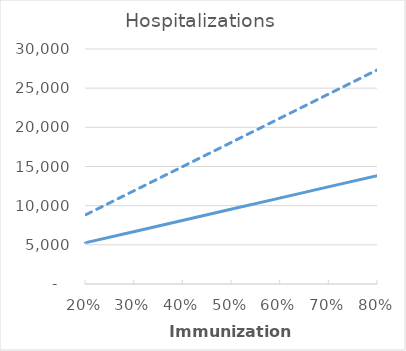
| Category | Low Efficacy, Low RSV Rates | High Efficacy, High RSV Rates |
|---|---|---|
| 0.2 | 5277.313 | 8857.338 |
| 0.30000000000000004 | 6707.168 | 11944.74 |
| 0.4 | 8137.023 | 15032.142 |
| 0.5 | 9566.878 | 18119.545 |
| 0.6 | 10996.733 | 21206.947 |
| 0.7 | 12426.588 | 24294.35 |
| 0.7999999999999999 | 13856.443 | 27381.752 |